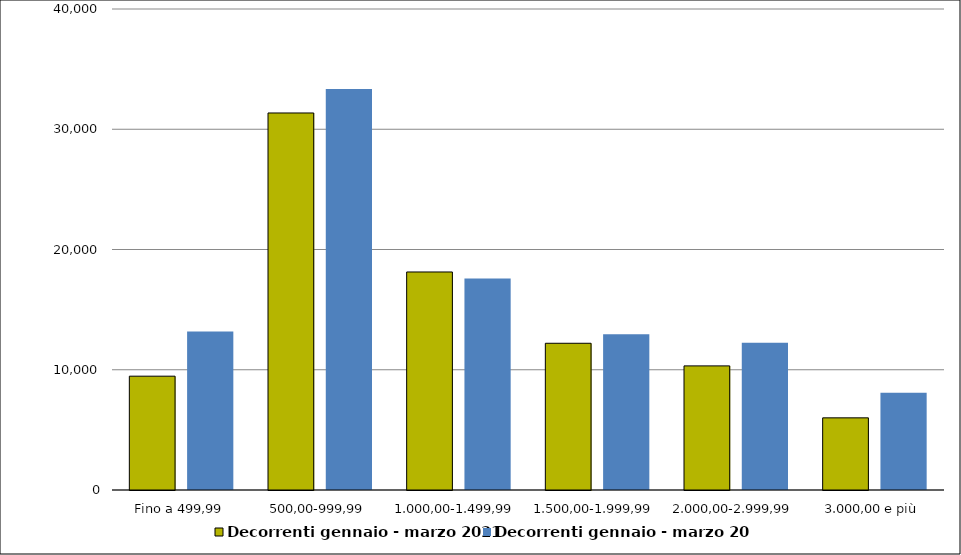
| Category | Decorrenti gennaio - marzo 2021 | Decorrenti gennaio - marzo 2020 |
|---|---|---|
| Fino a 499,99 | 9465 | 13172 |
| 500,00-999,99 | 31353 | 33352 |
| 1.000,00-1.499,99 | 18131 | 17584 |
| 1.500,00-1.999,99 | 12202 | 12942 |
| 2.000,00-2.999,99 | 10321 | 12247 |
| 3.000,00 e più | 6000 | 8097 |